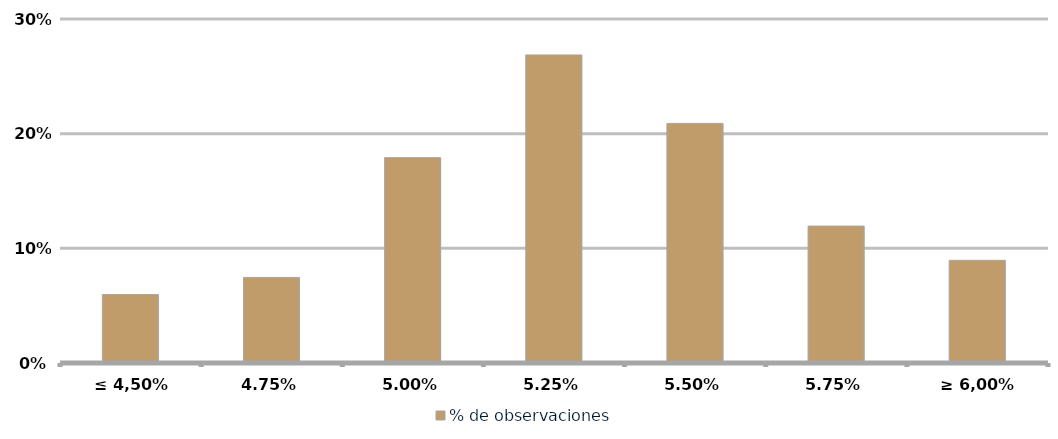
| Category | % de observaciones  |
|---|---|
| ≤ 4,50% | 0.06 |
| 4,75% | 0.075 |
| 5,00% | 0.179 |
| 5,25% | 0.269 |
| 5,50% | 0.209 |
| 5,75% | 0.119 |
| ≥ 6,00% | 0.09 |